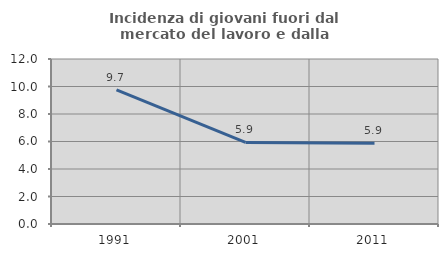
| Category | Incidenza di giovani fuori dal mercato del lavoro e dalla formazione  |
|---|---|
| 1991.0 | 9.747 |
| 2001.0 | 5.936 |
| 2011.0 | 5.872 |